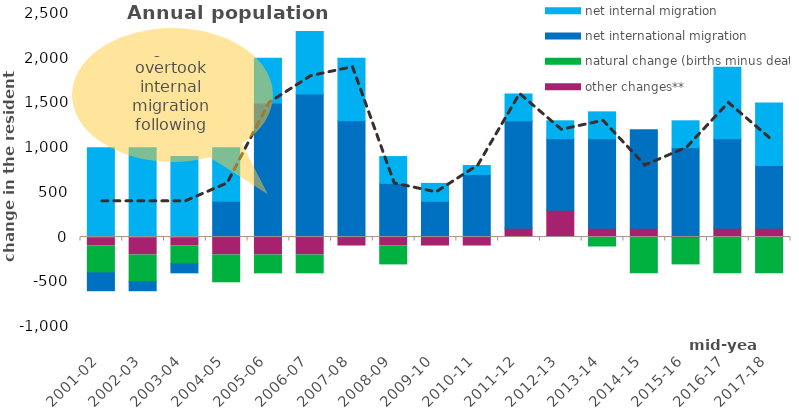
| Category | other changes** | natural change (births minus deaths)* | net international migration | net internal migration |
|---|---|---|---|---|
| 2001-02 | -100 | -300 | -200 | 1000 |
| 2002-03 | -200 | -300 | -100 | 1000 |
| 2003-04 | -100 | -200 | -100 | 900 |
| 2004-05 | -200 | -300 | 400 | 600 |
| 2005-06 | -200 | -200 | 1500 | 500 |
| 2006-07 | -200 | -200 | 1600 | 700 |
| 2007-08 | -100 | 0 | 1300 | 700 |
| 2008-09 | -100 | -200 | 600 | 300 |
| 2009-10 | -100 | 0 | 400 | 200 |
| 2010-11 | -100 | 0 | 700 | 100 |
| 2011-12 | 100 | 0 | 1200 | 300 |
| 2012-13 | 300 | 0 | 800 | 200 |
| 2013-14 | 100 | -100 | 1000 | 300 |
| 2014-15 | 100 | -400 | 1100 | 0 |
| 2015-16 | 0 | -300 | 1000 | 300 |
| 2016-17 | 100 | -400 | 1000 | 800 |
| 2017-18 | 100 | -400 | 700 | 700 |